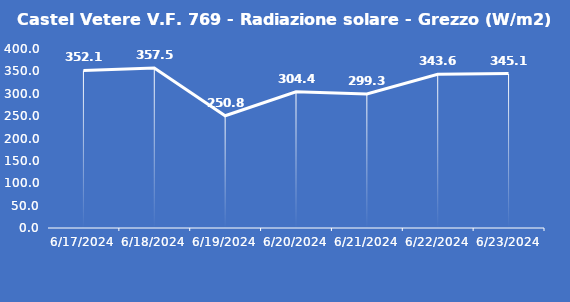
| Category | Castel Vetere V.F. 769 - Radiazione solare - Grezzo (W/m2) |
|---|---|
| 6/17/24 | 352.1 |
| 6/18/24 | 357.5 |
| 6/19/24 | 250.8 |
| 6/20/24 | 304.4 |
| 6/21/24 | 299.3 |
| 6/22/24 | 343.6 |
| 6/23/24 | 345.1 |